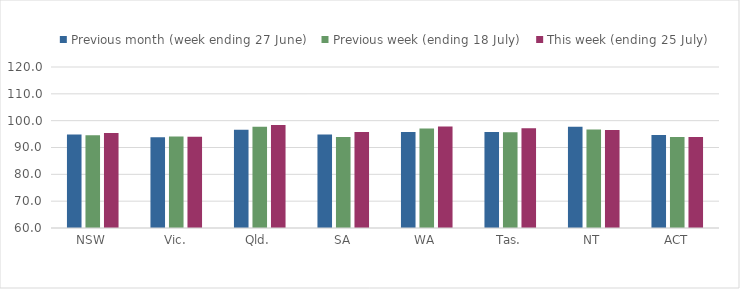
| Category | Previous month (week ending 27 June) | Previous week (ending 18 July) | This week (ending 25 July) |
|---|---|---|---|
| NSW | 94.849 | 94.539 | 95.412 |
| Vic. | 93.831 | 94.137 | 94.007 |
| Qld. | 96.609 | 97.777 | 98.413 |
| SA | 94.836 | 93.893 | 95.807 |
| WA | 95.755 | 97.112 | 97.816 |
| Tas. | 95.764 | 95.726 | 97.206 |
| NT | 97.766 | 96.692 | 96.526 |
| ACT | 94.668 | 93.869 | 93.938 |